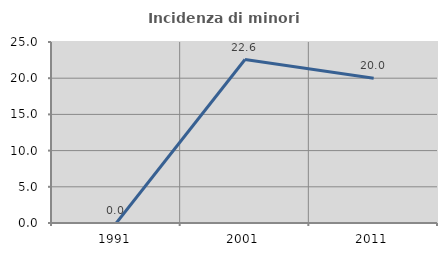
| Category | Incidenza di minori stranieri |
|---|---|
| 1991.0 | 0 |
| 2001.0 | 22.581 |
| 2011.0 | 20 |